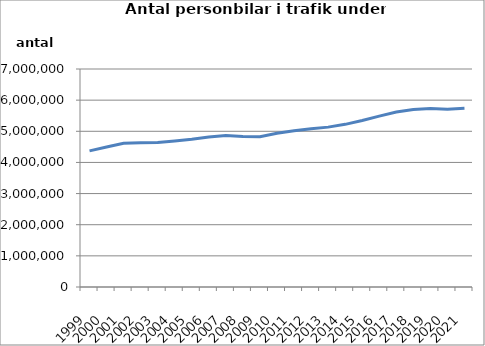
| Category | Series 0 |
|---|---|
| 1999.0 | 4370924 |
| 2000.0 | 4496868 |
| 2001.0 | 4616118 |
| 2002.0 | 4628334 |
| 2003.0 | 4643535 |
| 2004.0 | 4689599 |
| 2005.0 | 4744718 |
| 2006.0 | 4813525 |
| 2007.0 | 4867107 |
| 2008.0 | 4833533 |
| 2009.0 | 4827462 |
| 2010.0 | 4934447 |
| 2011.0 | 5017674 |
| 2012.0 | 5084351 |
| 2013.0 | 5133323 |
| 2014.0 | 5222751 |
| 2015.0 | 5346543 |
| 2016.0 | 5488070 |
| 2017.0 | 5619968 |
| 2018.0 | 5701798 |
| 2019.0 | 5733321 |
| 2020.0 | 5711535 |
| 2021.0 | 5741625 |